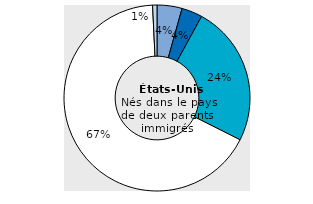
| Category | Series 1 |
|---|---|
| Europe | 4.351 |
| Africa | 3.603 |
| Asia | 24.468 |
| Latin America | 66.82 |
| North America and Oceania | 0.759 |